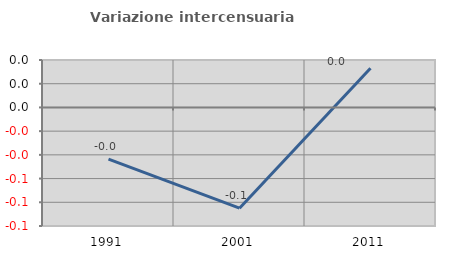
| Category | Variazione intercensuaria annua |
|---|---|
| 1991.0 | -0.044 |
| 2001.0 | -0.085 |
| 2011.0 | 0.033 |